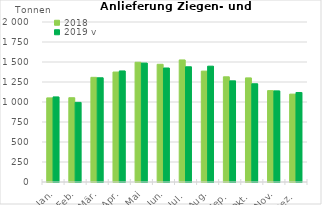
| Category | 2018 | 2019 v |
|---|---|---|
| 0 | 1051.264 | 1063.502 |
| 1 | 1053.339 | 995.183 |
| 2 | 1308.333 | 1302.926 |
| 3 | 1374.435 | 1388.264 |
| 4 | 1496.7 | 1486.839 |
| 5 | 1471.407 | 1425.119 |
| 6 | 1525.771 | 1440.326 |
| 7 | 1386.114 | 1447.799 |
| 8 | 1314.921 | 1264.6 |
| 9 | 1301.35 | 1228.051 |
| 10 | 1142.218 | 1139.023 |
| 11 | 1098.517 | 1118.752 |